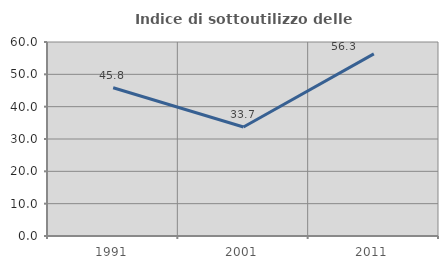
| Category | Indice di sottoutilizzo delle abitazioni  |
|---|---|
| 1991.0 | 45.833 |
| 2001.0 | 33.708 |
| 2011.0 | 56.322 |